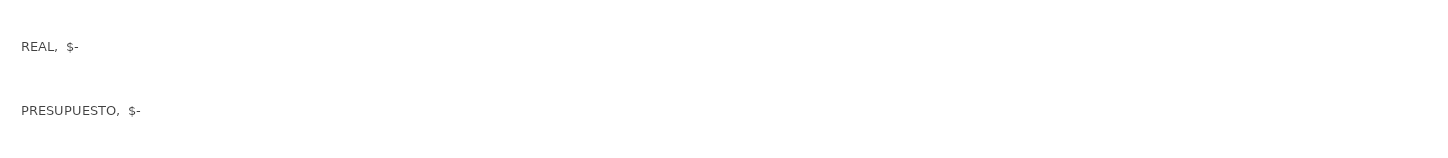
| Category | Series 0 |
|---|---|
| PRESUPUESTO | 0 |
| REAL | 0 |